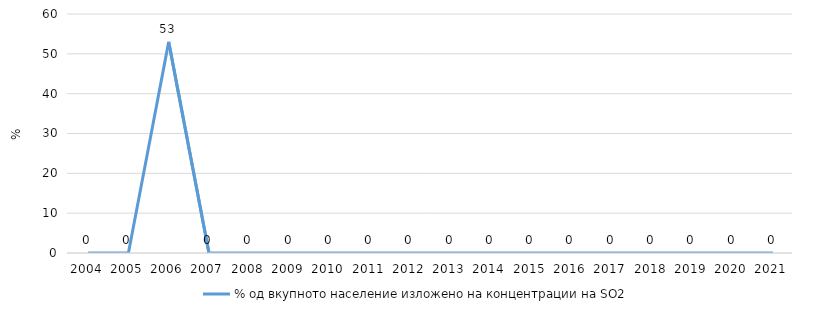
| Category | % од вкупното население изложено на концентрации на SO2 |
|---|---|
| 2004.0 | 0 |
| 2005.0 | 0 |
| 2006.0 | 53.001 |
| 2007.0 | 0 |
| 2008.0 | 0 |
| 2009.0 | 0 |
| 2010.0 | 0 |
| 2011.0 | 0 |
| 2012.0 | 0 |
| 2013.0 | 0 |
| 2014.0 | 0 |
| 2015.0 | 0 |
| 2016.0 | 0 |
| 2017.0 | 0 |
| 2018.0 | 0 |
| 2019.0 | 0 |
| 2020.0 | 0 |
| 2021.0 | 0 |